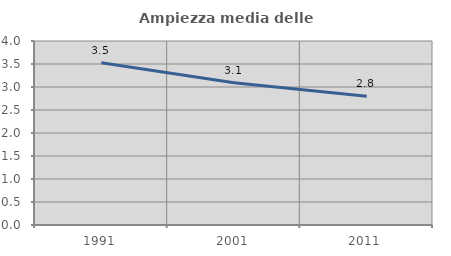
| Category | Ampiezza media delle famiglie |
|---|---|
| 1991.0 | 3.526 |
| 2001.0 | 3.091 |
| 2011.0 | 2.798 |